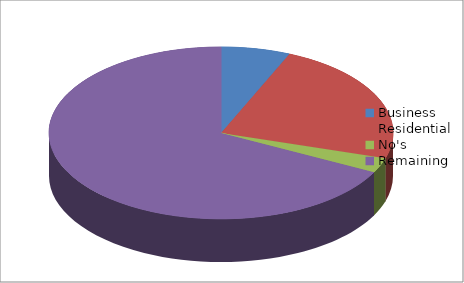
| Category | Series 0 |
|---|---|
| Business | 14 |
| Residential | 50 |
| No's | 6 |
| Remaining  | 145 |